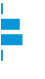
| Category | Series 0 |
|---|---|
| 0 | 0.023 |
| 1 | 0.443 |
| 2 | 0.512 |
| 3 | 0.022 |